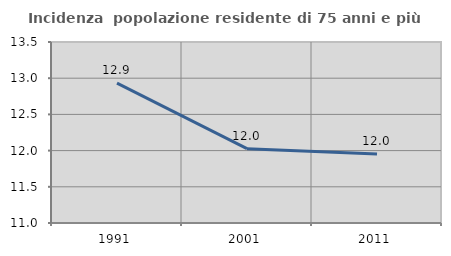
| Category | Incidenza  popolazione residente di 75 anni e più |
|---|---|
| 1991.0 | 12.932 |
| 2001.0 | 12.026 |
| 2011.0 | 11.954 |